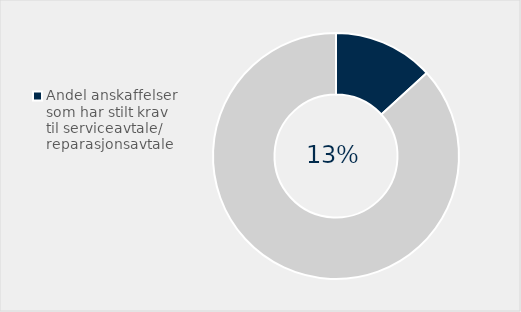
| Category | Series 0 |
|---|---|
| Andel anskaffelser som har stilt krav til serviceavtale/ reparasjonsavtale | 0.132 |
| Ikke stilt krav til bærekraftig skogbruk | 0.868 |